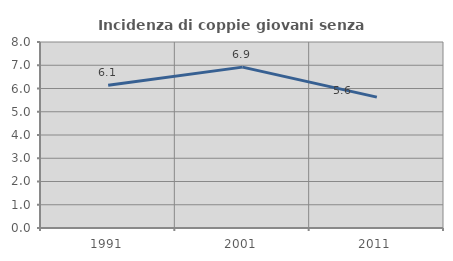
| Category | Incidenza di coppie giovani senza figli |
|---|---|
| 1991.0 | 6.138 |
| 2001.0 | 6.92 |
| 2011.0 | 5.63 |